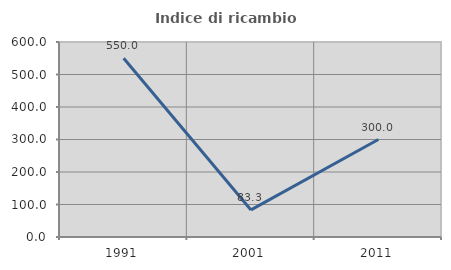
| Category | Indice di ricambio occupazionale  |
|---|---|
| 1991.0 | 550 |
| 2001.0 | 83.333 |
| 2011.0 | 300 |